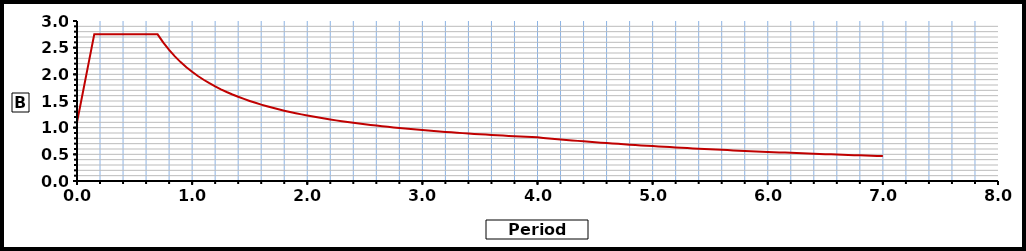
| Category | Series 0 |
|---|---|
| 0.0 | 1.1 |
| 0.05 | 1.65 |
| 0.1 | 2.2 |
| 0.15 | 2.75 |
| 0.2 | 2.75 |
| 0.25 | 2.75 |
| 0.3 | 2.75 |
| 0.35 | 2.75 |
| 0.4 | 2.75 |
| 0.45 | 2.75 |
| 0.5 | 2.75 |
| 0.55 | 2.75 |
| 0.6 | 2.75 |
| 0.65 | 2.75 |
| 0.7 | 2.75 |
| 0.75 | 2.594 |
| 0.8 | 2.457 |
| 0.85 | 2.337 |
| 0.9 | 2.23 |
| 0.95 | 2.134 |
| 1.0 | 2.047 |
| 1.05 | 1.969 |
| 1.1 | 1.898 |
| 1.15 | 1.834 |
| 1.2 | 1.774 |
| 1.25 | 1.72 |
| 1.3 | 1.669 |
| 1.35 | 1.623 |
| 1.4 | 1.579 |
| 1.45 | 1.539 |
| 1.5 | 1.501 |
| 1.55 | 1.466 |
| 1.6 | 1.433 |
| 1.65 | 1.402 |
| 1.7 | 1.373 |
| 1.75 | 1.345 |
| 1.8 | 1.319 |
| 1.85 | 1.294 |
| 1.9 | 1.271 |
| 1.95 | 1.249 |
| 2.0 | 1.228 |
| 2.05 | 1.208 |
| 2.1 | 1.189 |
| 2.15 | 1.171 |
| 2.2 | 1.153 |
| 2.25 | 1.137 |
| 2.3 | 1.121 |
| 2.35 | 1.106 |
| 2.4 | 1.091 |
| 2.45 | 1.077 |
| 2.5 | 1.064 |
| 2.55 | 1.051 |
| 2.6 | 1.039 |
| 2.65 | 1.027 |
| 2.7 | 1.015 |
| 2.75 | 1.004 |
| 2.8 | 0.994 |
| 2.85 | 0.983 |
| 2.9 | 0.974 |
| 2.95 | 0.964 |
| 3.0 | 0.955 |
| 3.05 | 0.946 |
| 3.1 | 0.937 |
| 3.15 | 0.929 |
| 3.2 | 0.921 |
| 3.25 | 0.913 |
| 3.3 | 0.905 |
| 3.35 | 0.898 |
| 3.4 | 0.89 |
| 3.45 | 0.883 |
| 3.5 | 0.877 |
| 3.55 | 0.87 |
| 3.6 | 0.864 |
| 3.65 | 0.857 |
| 3.7 | 0.851 |
| 3.75 | 0.845 |
| 3.8 | 0.84 |
| 3.85 | 0.834 |
| 3.9 | 0.829 |
| 3.95 | 0.823 |
| 4.0 | 0.818 |
| 4.05 | 0.808 |
| 4.1 | 0.798 |
| 4.15 | 0.789 |
| 4.2 | 0.779 |
| 4.25 | 0.77 |
| 4.3 | 0.761 |
| 4.35 | 0.752 |
| 4.4 | 0.744 |
| 4.45 | 0.735 |
| 4.5 | 0.727 |
| 4.55 | 0.719 |
| 4.6 | 0.711 |
| 4.65 | 0.704 |
| 4.7 | 0.696 |
| 4.75 | 0.689 |
| 4.8 | 0.682 |
| 4.85 | 0.675 |
| 4.9 | 0.668 |
| 4.95 | 0.661 |
| 5.0 | 0.654 |
| 5.05 | 0.648 |
| 5.1 | 0.642 |
| 5.15 | 0.635 |
| 5.2 | 0.629 |
| 5.25 | 0.623 |
| 5.3 | 0.617 |
| 5.35 | 0.612 |
| 5.4 | 0.606 |
| 5.45 | 0.6 |
| 5.5 | 0.595 |
| 5.55 | 0.59 |
| 5.6 | 0.584 |
| 5.65 | 0.579 |
| 5.7 | 0.574 |
| 5.75 | 0.569 |
| 5.8 | 0.564 |
| 5.85 | 0.559 |
| 5.9 | 0.555 |
| 5.95 | 0.55 |
| 6.0 | 0.545 |
| 6.05 | 0.541 |
| 6.1 | 0.536 |
| 6.15 | 0.532 |
| 6.2 | 0.528 |
| 6.25 | 0.524 |
| 6.3 | 0.519 |
| 6.35 | 0.515 |
| 6.4 | 0.511 |
| 6.45 | 0.507 |
| 6.5 | 0.503 |
| 6.55 | 0.5 |
| 6.6 | 0.496 |
| 6.65 | 0.492 |
| 6.7 | 0.488 |
| 6.75 | 0.485 |
| 6.8 | 0.481 |
| 6.85 | 0.478 |
| 6.9 | 0.474 |
| 6.95 | 0.471 |
| 7.0 | 0.467 |